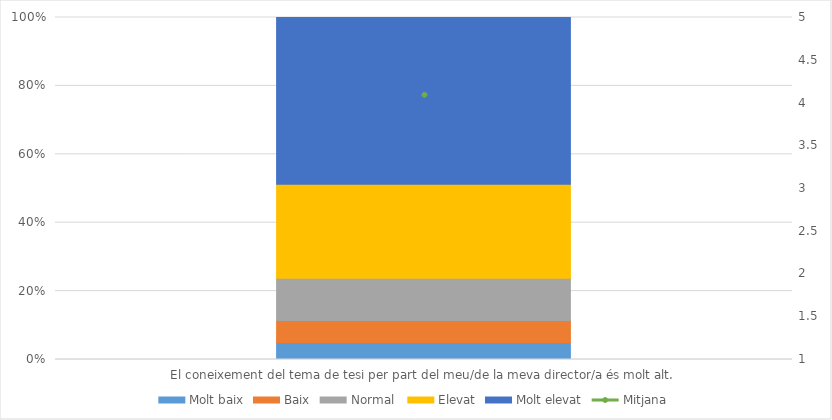
| Category | Molt baix | Baix | Normal  | Elevat | Molt elevat |
|---|---|---|---|---|---|
| El coneixement del tema de tesi per part del meu/de la meva director/a és molt alt. | 16 | 21 | 40 | 89 | 158 |